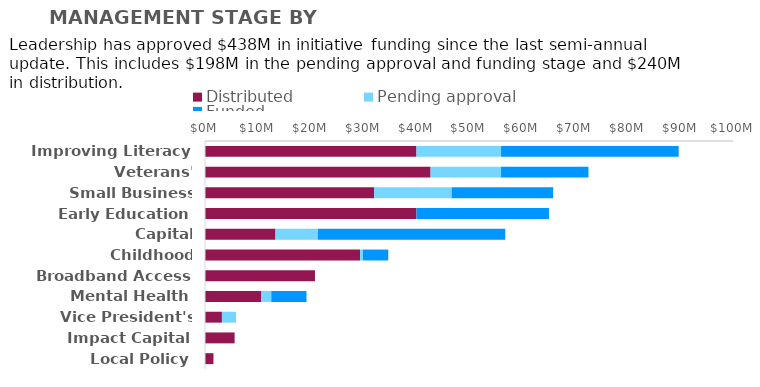
| Category | Distributed | Pending approval | Funded |
|---|---|---|---|
| Improving Literacy | 40.05 | 16.02 | 33.642 |
| Veterans' Microfinance | 42.72 | 13.35 | 16.554 |
| Small Business Grants | 32.04 | 14.685 | 19.224 |
| Early Education | 40.05 | 0 | 25.098 |
| Capital Infrastructure | 13.35 | 8.01 | 35.511 |
| Childhood Vaccinations | 29.37 | 0.534 | 4.806 |
| Broadband Access | 20.826 | 0 | 0 |
| Mental Health | 10.68 | 1.869 | 6.675 |
| Vice President's Fund | 3.204 | 2.67 | 0 |
| Impact Capital | 5.607 | 0 | 0 |
| Local Policy | 1.602 | 0 | 0 |